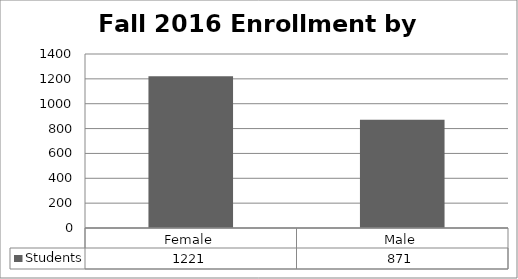
| Category | Students |
|---|---|
| Female | 1221 |
| Male | 871 |